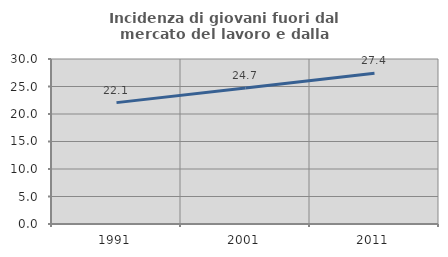
| Category | Incidenza di giovani fuori dal mercato del lavoro e dalla formazione  |
|---|---|
| 1991.0 | 22.069 |
| 2001.0 | 24.719 |
| 2011.0 | 27.419 |